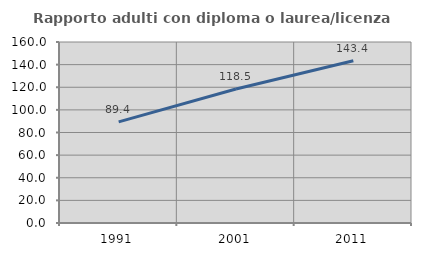
| Category | Rapporto adulti con diploma o laurea/licenza media  |
|---|---|
| 1991.0 | 89.431 |
| 2001.0 | 118.495 |
| 2011.0 | 143.396 |